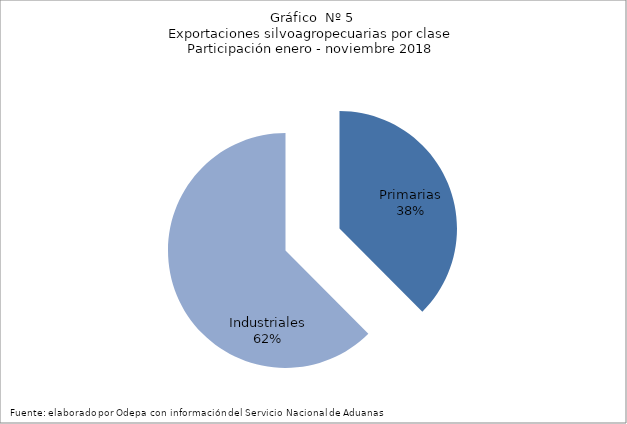
| Category | Series 0 |
|---|---|
| Primarias | 6138513 |
| Industriales | 10211370 |